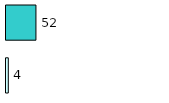
| Category | Series 0 | Series 1 |
|---|---|---|
| 0 | 4 | 52 |